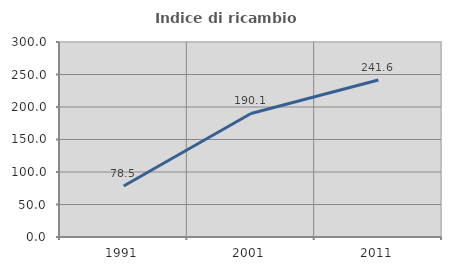
| Category | Indice di ricambio occupazionale  |
|---|---|
| 1991.0 | 78.472 |
| 2001.0 | 190.09 |
| 2011.0 | 241.593 |